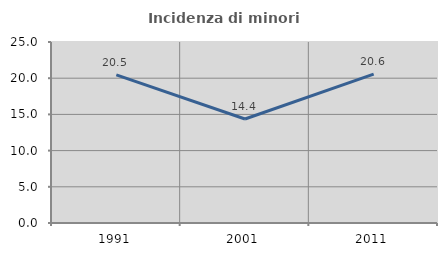
| Category | Incidenza di minori stranieri |
|---|---|
| 1991.0 | 20.455 |
| 2001.0 | 14.365 |
| 2011.0 | 20.559 |